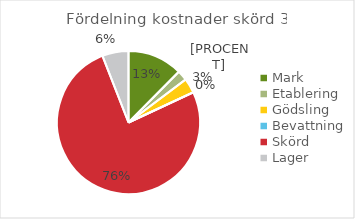
| Category | kr/kg ts |
|---|---|
| Mark | 0.259 |
| Etablering | 0.048 |
| Gödsling | 0.07 |
| Bevattning | 0 |
| Skörd | 1.581 |
| Lager | 0.124 |